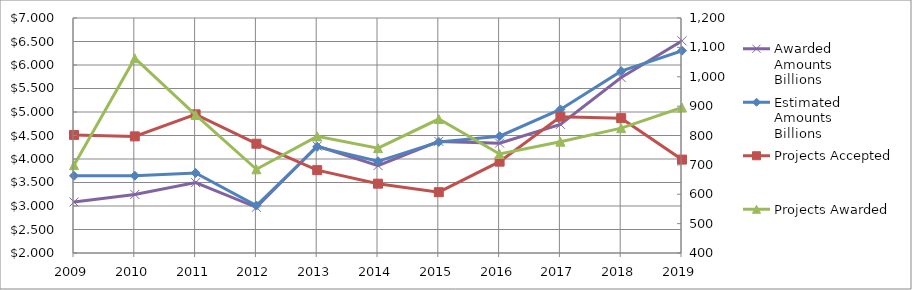
| Category | Awarded
Amounts
Billions | Estimated
Amounts
Billions |
|---|---|---|
| 2009.0 | 3.086 | 3.643 |
| 2010.0 | 3.246 | 3.644 |
| 2011.0 | 3.497 | 3.704 |
| 2012.0 | 2.972 | 3.01 |
| 2013.0 | 4.275 | 4.26 |
| 2014.0 | 3.86 | 3.951 |
| 2015.0 | 4.375 | 4.362 |
| 2016.0 | 4.338 | 4.484 |
| 2017.0 | 4.736 | 5.055 |
| 2018.0 | 5.733 | 5.869 |
| 2019.0 | 6.514 | 6.303 |